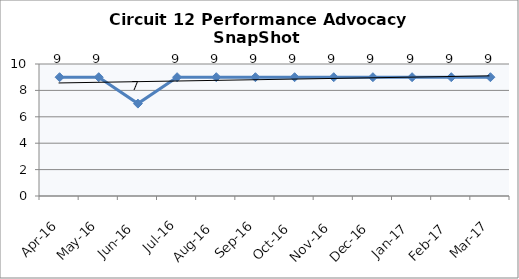
| Category | Circuit 12 |
|---|---|
| Apr-16 | 9 |
| May-16 | 9 |
| Jun-16 | 7 |
| Jul-16 | 9 |
| Aug-16 | 9 |
| Sep-16 | 9 |
| Oct-16 | 9 |
| Nov-16 | 9 |
| Dec-16 | 9 |
| Jan-17 | 9 |
| Feb-17 | 9 |
| Mar-17 | 9 |